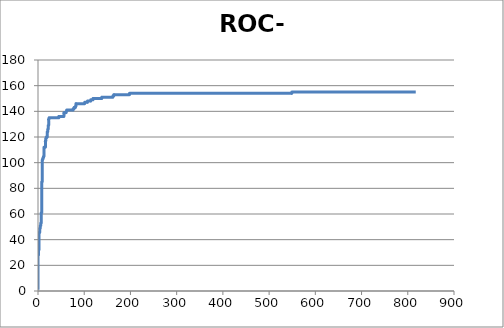
| Category | Series 0 |
|---|---|
| 0.0 | 1 |
| 0.0 | 2 |
| 0.0 | 3 |
| 0.0 | 4 |
| 0.0 | 5 |
| 0.0 | 6 |
| 0.0 | 7 |
| 0.0 | 8 |
| 0.0 | 9 |
| 0.0 | 10 |
| 0.0 | 11 |
| 0.0 | 12 |
| 0.0 | 13 |
| 0.0 | 14 |
| 0.0 | 15 |
| 0.0 | 16 |
| 0.0 | 17 |
| 0.0 | 18 |
| 0.0 | 19 |
| 0.0 | 20 |
| 0.0 | 21 |
| 0.0 | 22 |
| 0.0 | 23 |
| 0.0 | 24 |
| 0.0 | 25 |
| 0.0 | 26 |
| 0.0 | 27 |
| 0.0 | 28 |
| 1.0 | 28 |
| 1.0 | 29 |
| 1.0 | 30 |
| 1.0 | 31 |
| 1.0 | 32 |
| 2.0 | 32 |
| 2.0 | 33 |
| 2.0 | 34 |
| 2.0 | 35 |
| 2.0 | 36 |
| 2.0 | 37 |
| 2.0 | 38 |
| 2.0 | 39 |
| 2.0 | 40 |
| 2.0 | 41 |
| 2.0 | 42 |
| 2.0 | 43 |
| 2.0 | 44 |
| 2.0 | 45 |
| 3.0 | 45 |
| 3.0 | 46 |
| 4.0 | 46 |
| 4.0 | 47 |
| 4.0 | 48 |
| 4.0 | 49 |
| 5.0 | 49 |
| 5.0 | 50 |
| 5.0 | 51 |
| 6.0 | 51 |
| 6.0 | 52 |
| 6.0 | 53 |
| 7.0 | 53 |
| 7.0 | 54 |
| 7.0 | 55 |
| 7.0 | 56 |
| 7.0 | 57 |
| 7.0 | 58 |
| 7.0 | 59 |
| 7.0 | 60 |
| 7.0 | 61 |
| 8.0 | 61 |
| 8.0 | 62 |
| 8.0 | 63 |
| 8.0 | 64 |
| 8.0 | 65 |
| 8.0 | 66 |
| 8.0 | 67 |
| 8.0 | 68 |
| 8.0 | 69 |
| 8.0 | 70 |
| 8.0 | 71 |
| 8.0 | 72 |
| 8.0 | 73 |
| 8.0 | 74 |
| 8.0 | 75 |
| 8.0 | 76 |
| 8.0 | 77 |
| 8.0 | 78 |
| 8.0 | 79 |
| 8.0 | 80 |
| 8.0 | 81 |
| 8.0 | 82 |
| 8.0 | 83 |
| 8.0 | 84 |
| 8.0 | 85 |
| 9.0 | 85 |
| 9.0 | 86 |
| 9.0 | 87 |
| 9.0 | 88 |
| 9.0 | 89 |
| 9.0 | 90 |
| 9.0 | 91 |
| 9.0 | 92 |
| 9.0 | 93 |
| 9.0 | 94 |
| 9.0 | 95 |
| 9.0 | 96 |
| 9.0 | 97 |
| 9.0 | 98 |
| 9.0 | 99 |
| 9.0 | 100 |
| 9.0 | 101 |
| 9.0 | 102 |
| 10.0 | 102 |
| 10.0 | 103 |
| 11.0 | 103 |
| 11.0 | 104 |
| 12.0 | 104 |
| 12.0 | 105 |
| 13.0 | 105 |
| 13.0 | 106 |
| 13.0 | 107 |
| 13.0 | 108 |
| 13.0 | 109 |
| 13.0 | 110 |
| 13.0 | 111 |
| 13.0 | 112 |
| 14.0 | 112 |
| 15.0 | 112 |
| 16.0 | 112 |
| 16.0 | 113 |
| 16.0 | 114 |
| 16.0 | 115 |
| 16.0 | 116 |
| 16.0 | 117 |
| 17.0 | 117 |
| 17.0 | 118 |
| 17.0 | 119 |
| 18.0 | 119 |
| 18.0 | 120 |
| 19.0 | 120 |
| 20.0 | 120 |
| 20.0 | 121 |
| 20.0 | 122 |
| 20.0 | 123 |
| 20.0 | 124 |
| 21.0 | 124 |
| 21.0 | 125 |
| 21.0 | 126 |
| 22.0 | 126 |
| 22.0 | 127 |
| 22.0 | 128 |
| 22.0 | 129 |
| 23.0 | 129 |
| 23.0 | 130 |
| 23.0 | 131 |
| 23.0 | 132 |
| 23.0 | 133 |
| 23.0 | 134 |
| 24.0 | 134 |
| 24.0 | 135 |
| 25.0 | 135 |
| 26.0 | 135 |
| 27.0 | 135 |
| 28.0 | 135 |
| 29.0 | 135 |
| 30.0 | 135 |
| 31.0 | 135 |
| 32.0 | 135 |
| 33.0 | 135 |
| 34.0 | 135 |
| 35.0 | 135 |
| 36.0 | 135 |
| 37.0 | 135 |
| 38.0 | 135 |
| 39.0 | 135 |
| 40.0 | 135 |
| 41.0 | 135 |
| 42.0 | 135 |
| 43.0 | 135 |
| 44.0 | 135 |
| 45.0 | 135 |
| 45.0 | 136 |
| 46.0 | 136 |
| 47.0 | 136 |
| 48.0 | 136 |
| 49.0 | 136 |
| 50.0 | 136 |
| 51.0 | 136 |
| 52.0 | 136 |
| 53.0 | 136 |
| 54.0 | 136 |
| 55.0 | 136 |
| 56.0 | 136 |
| 56.0 | 137 |
| 56.0 | 138 |
| 56.0 | 139 |
| 57.0 | 139 |
| 58.0 | 139 |
| 59.0 | 139 |
| 60.0 | 139 |
| 61.0 | 139 |
| 61.0 | 140 |
| 62.0 | 140 |
| 62.0 | 141 |
| 63.0 | 141 |
| 64.0 | 141 |
| 65.0 | 141 |
| 66.0 | 141 |
| 67.0 | 141 |
| 68.0 | 141 |
| 69.0 | 141 |
| 70.0 | 141 |
| 71.0 | 141 |
| 72.0 | 141 |
| 73.0 | 141 |
| 74.0 | 141 |
| 75.0 | 141 |
| 76.0 | 141 |
| 76.0 | 142 |
| 77.0 | 142 |
| 78.0 | 142 |
| 78.0 | 143 |
| 79.0 | 143 |
| 80.0 | 143 |
| 81.0 | 143 |
| 81.0 | 144 |
| 82.0 | 144 |
| 82.0 | 145 |
| 82.0 | 146 |
| 83.0 | 146 |
| 84.0 | 146 |
| 85.0 | 146 |
| 86.0 | 146 |
| 87.0 | 146 |
| 88.0 | 146 |
| 89.0 | 146 |
| 90.0 | 146 |
| 91.0 | 146 |
| 92.0 | 146 |
| 93.0 | 146 |
| 94.0 | 146 |
| 95.0 | 146 |
| 96.0 | 146 |
| 97.0 | 146 |
| 98.0 | 146 |
| 99.0 | 146 |
| 100.0 | 146 |
| 101.0 | 146 |
| 101.0 | 147 |
| 102.0 | 147 |
| 103.0 | 147 |
| 104.0 | 147 |
| 105.0 | 147 |
| 106.0 | 147 |
| 107.0 | 147 |
| 107.0 | 148 |
| 108.0 | 148 |
| 109.0 | 148 |
| 110.0 | 148 |
| 111.0 | 148 |
| 112.0 | 148 |
| 113.0 | 148 |
| 114.0 | 148 |
| 114.0 | 149 |
| 115.0 | 149 |
| 116.0 | 149 |
| 117.0 | 149 |
| 118.0 | 149 |
| 119.0 | 149 |
| 119.0 | 150 |
| 120.0 | 150 |
| 121.0 | 150 |
| 122.0 | 150 |
| 123.0 | 150 |
| 124.0 | 150 |
| 125.0 | 150 |
| 126.0 | 150 |
| 127.0 | 150 |
| 128.0 | 150 |
| 129.0 | 150 |
| 130.0 | 150 |
| 131.0 | 150 |
| 132.0 | 150 |
| 133.0 | 150 |
| 134.0 | 150 |
| 135.0 | 150 |
| 136.0 | 150 |
| 137.0 | 150 |
| 138.0 | 150 |
| 138.0 | 151 |
| 139.0 | 151 |
| 140.0 | 151 |
| 141.0 | 151 |
| 142.0 | 151 |
| 143.0 | 151 |
| 144.0 | 151 |
| 145.0 | 151 |
| 146.0 | 151 |
| 147.0 | 151 |
| 148.0 | 151 |
| 149.0 | 151 |
| 150.0 | 151 |
| 151.0 | 151 |
| 152.0 | 151 |
| 153.0 | 151 |
| 154.0 | 151 |
| 155.0 | 151 |
| 156.0 | 151 |
| 157.0 | 151 |
| 158.0 | 151 |
| 159.0 | 151 |
| 160.0 | 151 |
| 161.0 | 151 |
| 162.0 | 151 |
| 162.0 | 152 |
| 163.0 | 152 |
| 164.0 | 152 |
| 164.0 | 153 |
| 165.0 | 153 |
| 166.0 | 153 |
| 167.0 | 153 |
| 168.0 | 153 |
| 169.0 | 153 |
| 170.0 | 153 |
| 171.0 | 153 |
| 172.0 | 153 |
| 173.0 | 153 |
| 174.0 | 153 |
| 175.0 | 153 |
| 176.0 | 153 |
| 177.0 | 153 |
| 178.0 | 153 |
| 179.0 | 153 |
| 180.0 | 153 |
| 181.0 | 153 |
| 182.0 | 153 |
| 183.0 | 153 |
| 184.0 | 153 |
| 185.0 | 153 |
| 186.0 | 153 |
| 187.0 | 153 |
| 188.0 | 153 |
| 189.0 | 153 |
| 190.0 | 153 |
| 191.0 | 153 |
| 192.0 | 153 |
| 193.0 | 153 |
| 194.0 | 153 |
| 195.0 | 153 |
| 196.0 | 153 |
| 197.0 | 153 |
| 198.0 | 153 |
| 198.0 | 154 |
| 199.0 | 154 |
| 200.0 | 154 |
| 201.0 | 154 |
| 202.0 | 154 |
| 203.0 | 154 |
| 204.0 | 154 |
| 205.0 | 154 |
| 206.0 | 154 |
| 207.0 | 154 |
| 208.0 | 154 |
| 209.0 | 154 |
| 210.0 | 154 |
| 211.0 | 154 |
| 212.0 | 154 |
| 213.0 | 154 |
| 214.0 | 154 |
| 215.0 | 154 |
| 216.0 | 154 |
| 217.0 | 154 |
| 218.0 | 154 |
| 219.0 | 154 |
| 220.0 | 154 |
| 221.0 | 154 |
| 222.0 | 154 |
| 223.0 | 154 |
| 224.0 | 154 |
| 225.0 | 154 |
| 226.0 | 154 |
| 227.0 | 154 |
| 228.0 | 154 |
| 229.0 | 154 |
| 230.0 | 154 |
| 231.0 | 154 |
| 232.0 | 154 |
| 233.0 | 154 |
| 234.0 | 154 |
| 235.0 | 154 |
| 236.0 | 154 |
| 237.0 | 154 |
| 238.0 | 154 |
| 239.0 | 154 |
| 240.0 | 154 |
| 241.0 | 154 |
| 242.0 | 154 |
| 243.0 | 154 |
| 244.0 | 154 |
| 245.0 | 154 |
| 246.0 | 154 |
| 247.0 | 154 |
| 248.0 | 154 |
| 249.0 | 154 |
| 250.0 | 154 |
| 251.0 | 154 |
| 252.0 | 154 |
| 253.0 | 154 |
| 254.0 | 154 |
| 255.0 | 154 |
| 256.0 | 154 |
| 257.0 | 154 |
| 258.0 | 154 |
| 259.0 | 154 |
| 260.0 | 154 |
| 261.0 | 154 |
| 262.0 | 154 |
| 263.0 | 154 |
| 264.0 | 154 |
| 265.0 | 154 |
| 266.0 | 154 |
| 267.0 | 154 |
| 268.0 | 154 |
| 269.0 | 154 |
| 270.0 | 154 |
| 271.0 | 154 |
| 272.0 | 154 |
| 273.0 | 154 |
| 274.0 | 154 |
| 275.0 | 154 |
| 276.0 | 154 |
| 277.0 | 154 |
| 278.0 | 154 |
| 279.0 | 154 |
| 280.0 | 154 |
| 281.0 | 154 |
| 282.0 | 154 |
| 283.0 | 154 |
| 284.0 | 154 |
| 285.0 | 154 |
| 286.0 | 154 |
| 287.0 | 154 |
| 288.0 | 154 |
| 289.0 | 154 |
| 290.0 | 154 |
| 291.0 | 154 |
| 292.0 | 154 |
| 293.0 | 154 |
| 294.0 | 154 |
| 295.0 | 154 |
| 296.0 | 154 |
| 297.0 | 154 |
| 298.0 | 154 |
| 299.0 | 154 |
| 300.0 | 154 |
| 301.0 | 154 |
| 302.0 | 154 |
| 303.0 | 154 |
| 304.0 | 154 |
| 305.0 | 154 |
| 306.0 | 154 |
| 307.0 | 154 |
| 308.0 | 154 |
| 309.0 | 154 |
| 310.0 | 154 |
| 311.0 | 154 |
| 312.0 | 154 |
| 313.0 | 154 |
| 314.0 | 154 |
| 315.0 | 154 |
| 316.0 | 154 |
| 317.0 | 154 |
| 318.0 | 154 |
| 319.0 | 154 |
| 320.0 | 154 |
| 321.0 | 154 |
| 322.0 | 154 |
| 323.0 | 154 |
| 324.0 | 154 |
| 325.0 | 154 |
| 326.0 | 154 |
| 327.0 | 154 |
| 328.0 | 154 |
| 329.0 | 154 |
| 330.0 | 154 |
| 331.0 | 154 |
| 332.0 | 154 |
| 333.0 | 154 |
| 334.0 | 154 |
| 335.0 | 154 |
| 336.0 | 154 |
| 337.0 | 154 |
| 338.0 | 154 |
| 339.0 | 154 |
| 340.0 | 154 |
| 341.0 | 154 |
| 342.0 | 154 |
| 343.0 | 154 |
| 344.0 | 154 |
| 345.0 | 154 |
| 346.0 | 154 |
| 347.0 | 154 |
| 348.0 | 154 |
| 349.0 | 154 |
| 350.0 | 154 |
| 351.0 | 154 |
| 352.0 | 154 |
| 353.0 | 154 |
| 354.0 | 154 |
| 355.0 | 154 |
| 356.0 | 154 |
| 357.0 | 154 |
| 358.0 | 154 |
| 359.0 | 154 |
| 360.0 | 154 |
| 361.0 | 154 |
| 362.0 | 154 |
| 363.0 | 154 |
| 364.0 | 154 |
| 365.0 | 154 |
| 366.0 | 154 |
| 367.0 | 154 |
| 368.0 | 154 |
| 369.0 | 154 |
| 370.0 | 154 |
| 371.0 | 154 |
| 372.0 | 154 |
| 373.0 | 154 |
| 374.0 | 154 |
| 375.0 | 154 |
| 376.0 | 154 |
| 377.0 | 154 |
| 378.0 | 154 |
| 379.0 | 154 |
| 380.0 | 154 |
| 381.0 | 154 |
| 382.0 | 154 |
| 383.0 | 154 |
| 384.0 | 154 |
| 385.0 | 154 |
| 386.0 | 154 |
| 387.0 | 154 |
| 388.0 | 154 |
| 389.0 | 154 |
| 390.0 | 154 |
| 391.0 | 154 |
| 392.0 | 154 |
| 393.0 | 154 |
| 394.0 | 154 |
| 395.0 | 154 |
| 396.0 | 154 |
| 397.0 | 154 |
| 398.0 | 154 |
| 399.0 | 154 |
| 400.0 | 154 |
| 401.0 | 154 |
| 402.0 | 154 |
| 403.0 | 154 |
| 404.0 | 154 |
| 405.0 | 154 |
| 406.0 | 154 |
| 407.0 | 154 |
| 408.0 | 154 |
| 409.0 | 154 |
| 410.0 | 154 |
| 411.0 | 154 |
| 412.0 | 154 |
| 413.0 | 154 |
| 414.0 | 154 |
| 415.0 | 154 |
| 416.0 | 154 |
| 417.0 | 154 |
| 418.0 | 154 |
| 419.0 | 154 |
| 420.0 | 154 |
| 421.0 | 154 |
| 422.0 | 154 |
| 423.0 | 154 |
| 424.0 | 154 |
| 425.0 | 154 |
| 426.0 | 154 |
| 427.0 | 154 |
| 428.0 | 154 |
| 429.0 | 154 |
| 430.0 | 154 |
| 431.0 | 154 |
| 432.0 | 154 |
| 433.0 | 154 |
| 434.0 | 154 |
| 435.0 | 154 |
| 436.0 | 154 |
| 437.0 | 154 |
| 438.0 | 154 |
| 439.0 | 154 |
| 440.0 | 154 |
| 441.0 | 154 |
| 442.0 | 154 |
| 443.0 | 154 |
| 444.0 | 154 |
| 445.0 | 154 |
| 446.0 | 154 |
| 447.0 | 154 |
| 448.0 | 154 |
| 449.0 | 154 |
| 450.0 | 154 |
| 451.0 | 154 |
| 452.0 | 154 |
| 453.0 | 154 |
| 454.0 | 154 |
| 455.0 | 154 |
| 456.0 | 154 |
| 457.0 | 154 |
| 458.0 | 154 |
| 459.0 | 154 |
| 460.0 | 154 |
| 461.0 | 154 |
| 462.0 | 154 |
| 463.0 | 154 |
| 464.0 | 154 |
| 465.0 | 154 |
| 466.0 | 154 |
| 467.0 | 154 |
| 468.0 | 154 |
| 469.0 | 154 |
| 470.0 | 154 |
| 471.0 | 154 |
| 472.0 | 154 |
| 473.0 | 154 |
| 474.0 | 154 |
| 475.0 | 154 |
| 476.0 | 154 |
| 477.0 | 154 |
| 478.0 | 154 |
| 479.0 | 154 |
| 480.0 | 154 |
| 481.0 | 154 |
| 482.0 | 154 |
| 483.0 | 154 |
| 484.0 | 154 |
| 485.0 | 154 |
| 486.0 | 154 |
| 487.0 | 154 |
| 488.0 | 154 |
| 489.0 | 154 |
| 490.0 | 154 |
| 491.0 | 154 |
| 492.0 | 154 |
| 493.0 | 154 |
| 494.0 | 154 |
| 495.0 | 154 |
| 496.0 | 154 |
| 497.0 | 154 |
| 498.0 | 154 |
| 499.0 | 154 |
| 500.0 | 154 |
| 501.0 | 154 |
| 502.0 | 154 |
| 503.0 | 154 |
| 504.0 | 154 |
| 505.0 | 154 |
| 506.0 | 154 |
| 507.0 | 154 |
| 508.0 | 154 |
| 509.0 | 154 |
| 510.0 | 154 |
| 511.0 | 154 |
| 512.0 | 154 |
| 513.0 | 154 |
| 514.0 | 154 |
| 515.0 | 154 |
| 516.0 | 154 |
| 517.0 | 154 |
| 518.0 | 154 |
| 519.0 | 154 |
| 520.0 | 154 |
| 521.0 | 154 |
| 522.0 | 154 |
| 523.0 | 154 |
| 524.0 | 154 |
| 525.0 | 154 |
| 526.0 | 154 |
| 527.0 | 154 |
| 528.0 | 154 |
| 529.0 | 154 |
| 530.0 | 154 |
| 531.0 | 154 |
| 532.0 | 154 |
| 533.0 | 154 |
| 534.0 | 154 |
| 535.0 | 154 |
| 536.0 | 154 |
| 537.0 | 154 |
| 538.0 | 154 |
| 539.0 | 154 |
| 540.0 | 154 |
| 541.0 | 154 |
| 542.0 | 154 |
| 543.0 | 154 |
| 544.0 | 154 |
| 545.0 | 154 |
| 546.0 | 154 |
| 547.0 | 154 |
| 548.0 | 154 |
| 549.0 | 154 |
| 549.0 | 155 |
| 550.0 | 155 |
| 551.0 | 155 |
| 552.0 | 155 |
| 553.0 | 155 |
| 554.0 | 155 |
| 555.0 | 155 |
| 556.0 | 155 |
| 557.0 | 155 |
| 558.0 | 155 |
| 559.0 | 155 |
| 560.0 | 155 |
| 561.0 | 155 |
| 562.0 | 155 |
| 563.0 | 155 |
| 564.0 | 155 |
| 565.0 | 155 |
| 566.0 | 155 |
| 567.0 | 155 |
| 568.0 | 155 |
| 569.0 | 155 |
| 570.0 | 155 |
| 571.0 | 155 |
| 572.0 | 155 |
| 573.0 | 155 |
| 574.0 | 155 |
| 575.0 | 155 |
| 576.0 | 155 |
| 577.0 | 155 |
| 578.0 | 155 |
| 579.0 | 155 |
| 580.0 | 155 |
| 581.0 | 155 |
| 582.0 | 155 |
| 583.0 | 155 |
| 584.0 | 155 |
| 585.0 | 155 |
| 586.0 | 155 |
| 587.0 | 155 |
| 588.0 | 155 |
| 589.0 | 155 |
| 590.0 | 155 |
| 591.0 | 155 |
| 592.0 | 155 |
| 593.0 | 155 |
| 594.0 | 155 |
| 595.0 | 155 |
| 596.0 | 155 |
| 597.0 | 155 |
| 598.0 | 155 |
| 599.0 | 155 |
| 600.0 | 155 |
| 601.0 | 155 |
| 602.0 | 155 |
| 603.0 | 155 |
| 604.0 | 155 |
| 605.0 | 155 |
| 606.0 | 155 |
| 607.0 | 155 |
| 608.0 | 155 |
| 609.0 | 155 |
| 610.0 | 155 |
| 611.0 | 155 |
| 612.0 | 155 |
| 613.0 | 155 |
| 614.0 | 155 |
| 615.0 | 155 |
| 616.0 | 155 |
| 617.0 | 155 |
| 618.0 | 155 |
| 619.0 | 155 |
| 620.0 | 155 |
| 621.0 | 155 |
| 622.0 | 155 |
| 623.0 | 155 |
| 624.0 | 155 |
| 625.0 | 155 |
| 626.0 | 155 |
| 627.0 | 155 |
| 628.0 | 155 |
| 629.0 | 155 |
| 630.0 | 155 |
| 631.0 | 155 |
| 632.0 | 155 |
| 633.0 | 155 |
| 634.0 | 155 |
| 635.0 | 155 |
| 636.0 | 155 |
| 637.0 | 155 |
| 638.0 | 155 |
| 639.0 | 155 |
| 640.0 | 155 |
| 641.0 | 155 |
| 642.0 | 155 |
| 643.0 | 155 |
| 644.0 | 155 |
| 645.0 | 155 |
| 646.0 | 155 |
| 647.0 | 155 |
| 648.0 | 155 |
| 649.0 | 155 |
| 650.0 | 155 |
| 651.0 | 155 |
| 652.0 | 155 |
| 653.0 | 155 |
| 654.0 | 155 |
| 655.0 | 155 |
| 656.0 | 155 |
| 657.0 | 155 |
| 658.0 | 155 |
| 659.0 | 155 |
| 660.0 | 155 |
| 661.0 | 155 |
| 662.0 | 155 |
| 663.0 | 155 |
| 664.0 | 155 |
| 665.0 | 155 |
| 666.0 | 155 |
| 667.0 | 155 |
| 668.0 | 155 |
| 669.0 | 155 |
| 670.0 | 155 |
| 671.0 | 155 |
| 672.0 | 155 |
| 673.0 | 155 |
| 674.0 | 155 |
| 675.0 | 155 |
| 676.0 | 155 |
| 677.0 | 155 |
| 678.0 | 155 |
| 679.0 | 155 |
| 680.0 | 155 |
| 681.0 | 155 |
| 682.0 | 155 |
| 683.0 | 155 |
| 684.0 | 155 |
| 685.0 | 155 |
| 686.0 | 155 |
| 687.0 | 155 |
| 688.0 | 155 |
| 689.0 | 155 |
| 690.0 | 155 |
| 691.0 | 155 |
| 692.0 | 155 |
| 693.0 | 155 |
| 694.0 | 155 |
| 695.0 | 155 |
| 696.0 | 155 |
| 697.0 | 155 |
| 698.0 | 155 |
| 699.0 | 155 |
| 700.0 | 155 |
| 701.0 | 155 |
| 702.0 | 155 |
| 703.0 | 155 |
| 704.0 | 155 |
| 705.0 | 155 |
| 706.0 | 155 |
| 707.0 | 155 |
| 708.0 | 155 |
| 709.0 | 155 |
| 710.0 | 155 |
| 711.0 | 155 |
| 712.0 | 155 |
| 713.0 | 155 |
| 714.0 | 155 |
| 715.0 | 155 |
| 716.0 | 155 |
| 717.0 | 155 |
| 718.0 | 155 |
| 719.0 | 155 |
| 720.0 | 155 |
| 721.0 | 155 |
| 722.0 | 155 |
| 723.0 | 155 |
| 724.0 | 155 |
| 725.0 | 155 |
| 726.0 | 155 |
| 727.0 | 155 |
| 728.0 | 155 |
| 729.0 | 155 |
| 730.0 | 155 |
| 731.0 | 155 |
| 732.0 | 155 |
| 733.0 | 155 |
| 734.0 | 155 |
| 735.0 | 155 |
| 736.0 | 155 |
| 737.0 | 155 |
| 738.0 | 155 |
| 739.0 | 155 |
| 740.0 | 155 |
| 741.0 | 155 |
| 742.0 | 155 |
| 743.0 | 155 |
| 744.0 | 155 |
| 745.0 | 155 |
| 746.0 | 155 |
| 747.0 | 155 |
| 748.0 | 155 |
| 749.0 | 155 |
| 750.0 | 155 |
| 751.0 | 155 |
| 752.0 | 155 |
| 753.0 | 155 |
| 754.0 | 155 |
| 755.0 | 155 |
| 756.0 | 155 |
| 757.0 | 155 |
| 758.0 | 155 |
| 759.0 | 155 |
| 760.0 | 155 |
| 761.0 | 155 |
| 762.0 | 155 |
| 763.0 | 155 |
| 764.0 | 155 |
| 765.0 | 155 |
| 766.0 | 155 |
| 767.0 | 155 |
| 768.0 | 155 |
| 769.0 | 155 |
| 770.0 | 155 |
| 771.0 | 155 |
| 772.0 | 155 |
| 773.0 | 155 |
| 774.0 | 155 |
| 775.0 | 155 |
| 776.0 | 155 |
| 777.0 | 155 |
| 778.0 | 155 |
| 779.0 | 155 |
| 780.0 | 155 |
| 781.0 | 155 |
| 782.0 | 155 |
| 783.0 | 155 |
| 784.0 | 155 |
| 785.0 | 155 |
| 786.0 | 155 |
| 787.0 | 155 |
| 788.0 | 155 |
| 789.0 | 155 |
| 790.0 | 155 |
| 791.0 | 155 |
| 792.0 | 155 |
| 793.0 | 155 |
| 794.0 | 155 |
| 795.0 | 155 |
| 796.0 | 155 |
| 797.0 | 155 |
| 798.0 | 155 |
| 799.0 | 155 |
| 800.0 | 155 |
| 801.0 | 155 |
| 802.0 | 155 |
| 803.0 | 155 |
| 804.0 | 155 |
| 805.0 | 155 |
| 806.0 | 155 |
| 807.0 | 155 |
| 808.0 | 155 |
| 809.0 | 155 |
| 810.0 | 155 |
| 811.0 | 155 |
| 812.0 | 155 |
| 813.0 | 155 |
| 814.0 | 155 |
| 815.0 | 155 |
| 816.0 | 155 |
| 817.0 | 155 |